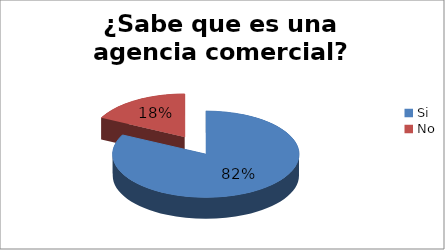
| Category | Series 0 |
|---|---|
| Si | 14 |
| No | 3 |